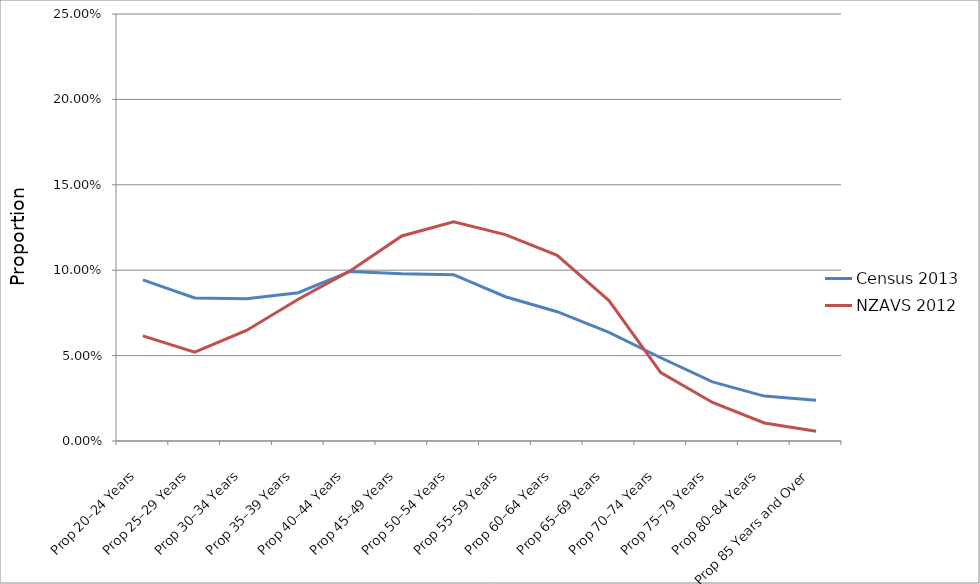
| Category | Census 2013 | NZAVS 2012 |
|---|---|---|
| Prop 20–24 Years | 0.094 | 0.062 |
| Prop 25–29 Years | 0.084 | 0.052 |
| Prop 30–34 Years | 0.083 | 0.065 |
| Prop 35–39 Years | 0.087 | 0.083 |
| Prop 40–44 Years | 0.099 | 0.1 |
| Prop 45–49 Years | 0.098 | 0.12 |
| Prop 50–54 Years | 0.097 | 0.128 |
| Prop 55–59 Years | 0.084 | 0.121 |
| Prop 60–64 Years | 0.076 | 0.109 |
| Prop 65–69 Years | 0.064 | 0.082 |
| Prop 70–74 Years | 0.049 | 0.04 |
| Prop 75–79 Years | 0.035 | 0.023 |
| Prop 80–84 Years | 0.026 | 0.011 |
| Prop 85 Years and Over | 0.024 | 0.006 |